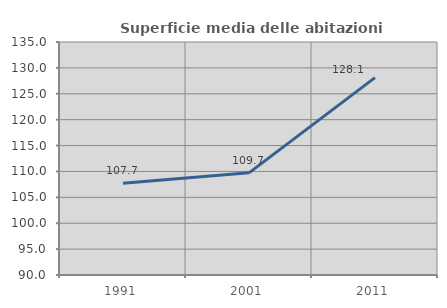
| Category | Superficie media delle abitazioni occupate |
|---|---|
| 1991.0 | 107.698 |
| 2001.0 | 109.729 |
| 2011.0 | 128.123 |